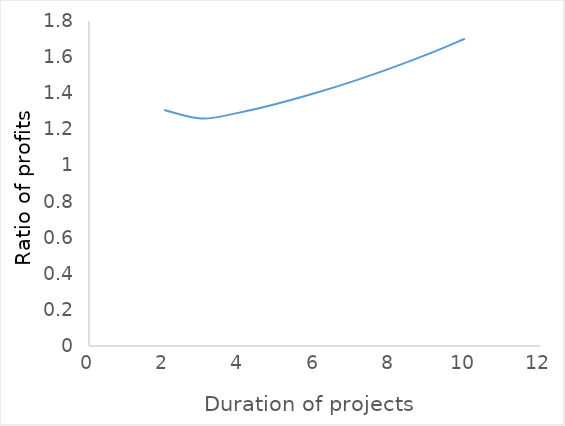
| Category | Series 0 |
|---|---|
| 2.0 | 1.308 |
| 3.0 | 1.26 |
| 4.0 | 1.293 |
| 5.0 | 1.342 |
| 6.0 | 1.399 |
| 7.0 | 1.464 |
| 8.0 | 1.536 |
| 9.0 | 1.615 |
| 10.0 | 1.701 |